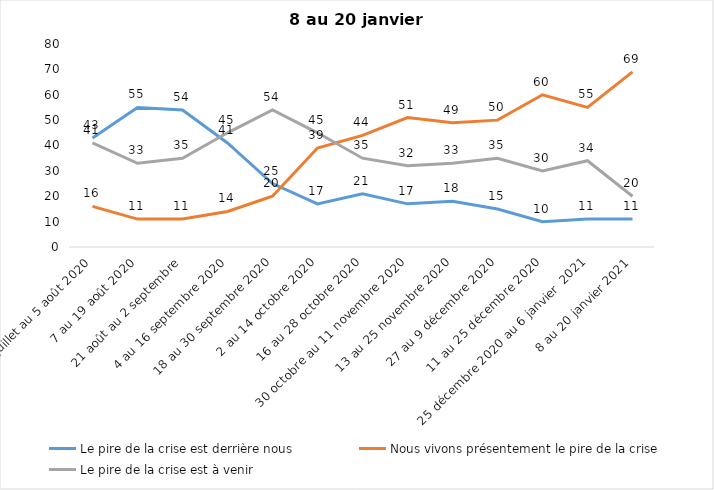
| Category | Le pire de la crise est derrière nous | Nous vivons présentement le pire de la crise | Le pire de la crise est à venir |
|---|---|---|---|
| 24 juillet au 5 août 2020 | 43 | 16 | 41 |
| 7 au 19 août 2020 | 55 | 11 | 33 |
| 21 août au 2 septembre | 54 | 11 | 35 |
| 4 au 16 septembre 2020 | 41 | 14 | 45 |
| 18 au 30 septembre 2020 | 25 | 20 | 54 |
| 2 au 14 octobre 2020 | 17 | 39 | 45 |
| 16 au 28 octobre 2020 | 21 | 44 | 35 |
| 30 octobre au 11 novembre 2020 | 17 | 51 | 32 |
| 13 au 25 novembre 2020 | 18 | 49 | 33 |
| 27 au 9 décembre 2020 | 15 | 50 | 35 |
| 11 au 25 décembre 2020 | 10 | 60 | 30 |
| 25 décembre 2020 au 6 janvier  2021 | 11 | 55 | 34 |
| 8 au 20 janvier 2021 | 11 | 69 | 20 |